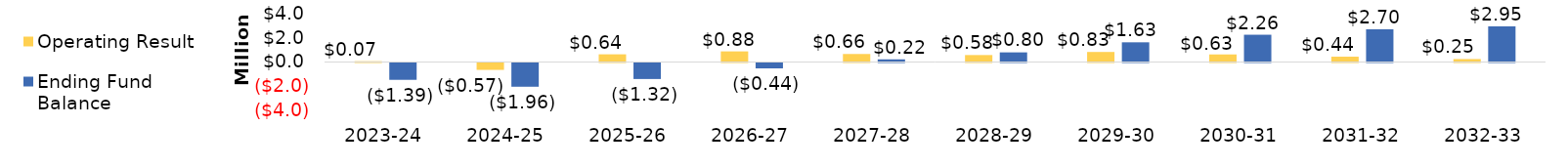
| Category | Operating Result | Ending Fund Balance |
|---|---|---|
| 2023-24 | 66455.258 | -1392285.742 |
| 2024-25 | -570182.436 | -1962468.178 |
| 2025-26 | 638265.232 | -1324202.946 |
| 2026-27 | 880787.077 | -443415.869 |
| 2027-28 | 664301.398 | 220885.529 |
| 2028-29 | 577739.908 | 798625.437 |
| 2029-30 | 831880.373 | 1630505.811 |
| 2030-31 | 627980.935 | 2258486.745 |
| 2031-32 | 441580.45 | 2700067.195 |
| 2032-33 | 246667.042 | 2946734.237 |